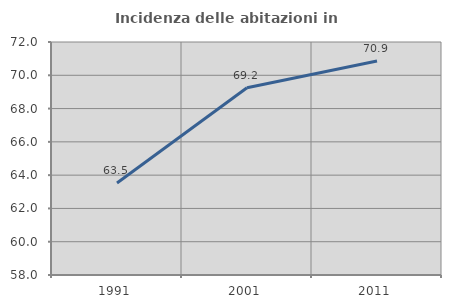
| Category | Incidenza delle abitazioni in proprietà  |
|---|---|
| 1991.0 | 63.532 |
| 2001.0 | 69.247 |
| 2011.0 | 70.857 |